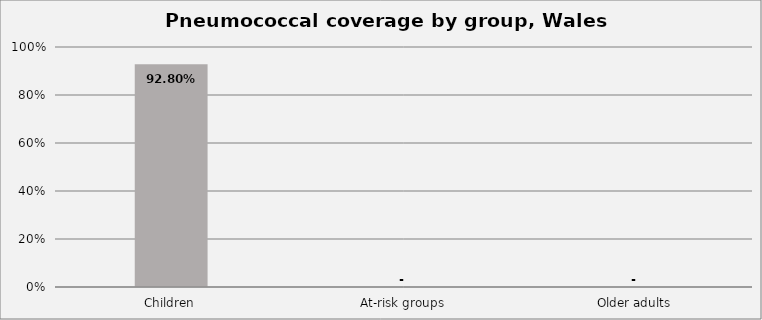
| Category | Series 0 |
|---|---|
| Children | 0.928 |
| At-risk groups | 0 |
| Older adults | 0 |